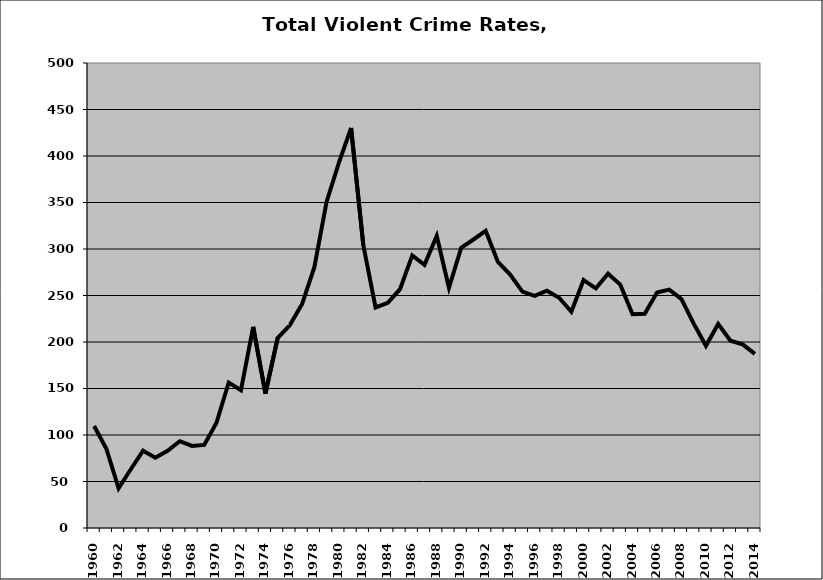
| Category | VCR |
|---|---|
| 1960.0 | 109.675 |
| 1961.0 | 85.207 |
| 1962.0 | 42.74 |
| 1963.0 | 63.205 |
| 1964.0 | 83.09 |
| 1965.0 | 75.588 |
| 1966.0 | 82.979 |
| 1967.0 | 93.333 |
| 1968.0 | 88.254 |
| 1969.0 | 89.375 |
| 1970.0 | 113.111 |
| 1971.0 | 156.471 |
| 1972.0 | 148.116 |
| 1973.0 | 216.147 |
| 1974.0 | 144.568 |
| 1975.0 | 204.278 |
| 1976.0 | 218.205 |
| 1977.0 | 240.887 |
| 1978.0 | 280.425 |
| 1979.0 | 350.889 |
| 1980.0 | 392.576 |
| 1981.0 | 430.081 |
| 1982.0 | 304.183 |
| 1983.0 | 237.16 |
| 1984.0 | 242.074 |
| 1985.0 | 256.778 |
| 1986.0 | 293.097 |
| 1987.0 | 283.061 |
| 1988.0 | 314.013 |
| 1989.0 | 258.316 |
| 1990.0 | 301.375 |
| 1991.0 | 310.217 |
| 1992.0 | 319.528 |
| 1993.0 | 286.17 |
| 1994.0 | 272.479 |
| 1995.0 | 254.167 |
| 1996.0 | 249.688 |
| 1997.0 | 255.208 |
| 1998.0 | 247.609 |
| 1999.0 | 232.484 |
| 2000.0 | 266.514 |
| 2001.0 | 257.618 |
| 2002.0 | 273.44 |
| 2003.0 | 261.695 |
| 2004.0 | 229.893 |
| 2005.0 | 230.347 |
| 2006.0 | 253.202 |
| 2007.0 | 256.297 |
| 2008.0 | 246.163 |
| 2009.0 | 219.744 |
| 2010.0 | 195.875 |
| 2011.0 | 219.439 |
| 2012.0 | 201.344 |
| 2013.0 | 197.523 |
| 2014.0 | 187.28 |